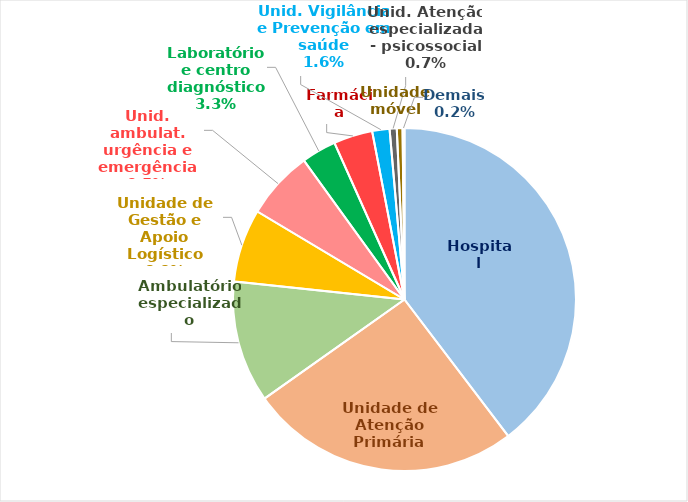
| Category | % do total 2015-2019 |
|---|---|
| Hospital | 39.659 |
| Unidade de Atenção Primária | 25.535 |
| Ambulatório especializado | 11.49 |
| Unidade de Gestão e Apoio Logístico | 6.891 |
| Unid. ambulat. urgência e emergência | 6.458 |
| Laboratório e centro diagnóstico | 3.272 |
| Farmácia | 3.67 |
| Unid. Vigilância e Prevenção em saúde | 1.633 |
| Unid. Atenção especializada - psicossocial | 0.672 |
| Unidade móvel | 0.539 |
| Demais | 0.181 |